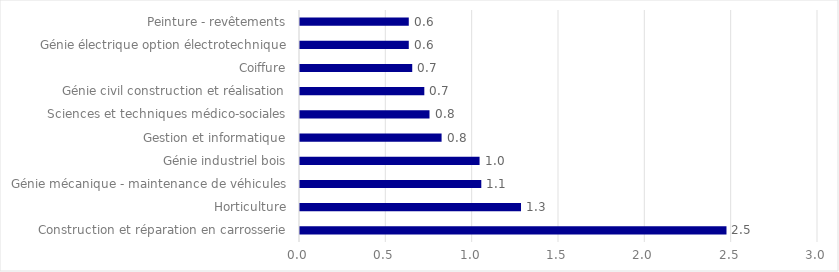
| Category | Proportion d'agents arrêtés au moins une fois (en %) |
|---|---|
| Construction et réparation en carrosserie | 2.47 |
| Horticulture | 1.28 |
| Génie mécanique - maintenance de véhicules | 1.05 |
| Génie industriel bois | 1.04 |
| Gestion et informatique | 0.82 |
| Sciences et techniques médico-sociales | 0.75 |
| Génie civil construction et réalisation | 0.72 |
| Coiffure | 0.65 |
| Génie électrique option électrotechnique | 0.63 |
| Peinture - revêtements | 0.63 |